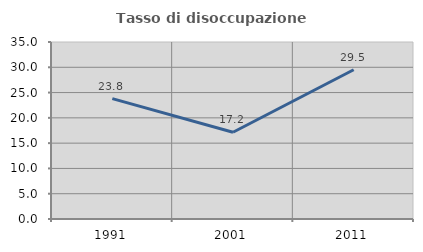
| Category | Tasso di disoccupazione giovanile  |
|---|---|
| 1991.0 | 23.804 |
| 2001.0 | 17.16 |
| 2011.0 | 29.51 |